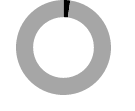
| Category | Series 0 |
|---|---|
| 0 | 0.023 |
| 1 | 0.977 |